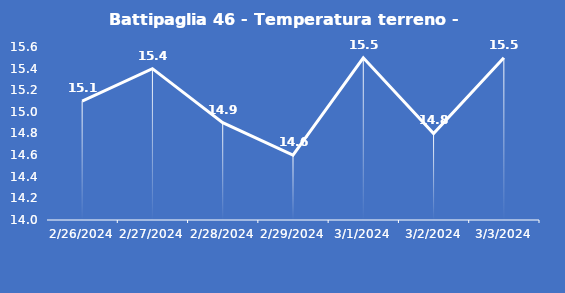
| Category | Battipaglia 46 - Temperatura terreno - Max (°C) |
|---|---|
| 2/26/24 | 15.1 |
| 2/27/24 | 15.4 |
| 2/28/24 | 14.9 |
| 2/29/24 | 14.6 |
| 3/1/24 | 15.5 |
| 3/2/24 | 14.8 |
| 3/3/24 | 15.5 |